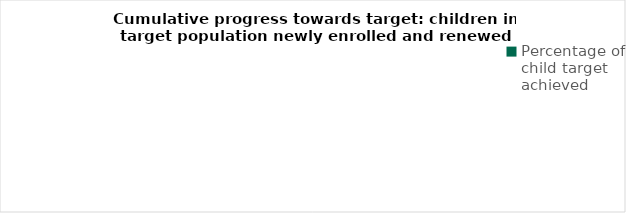
| Category | Series 0 |
|---|---|
| Percentage of child target achieved | 0 |
| Remaining progress needed | 0 |